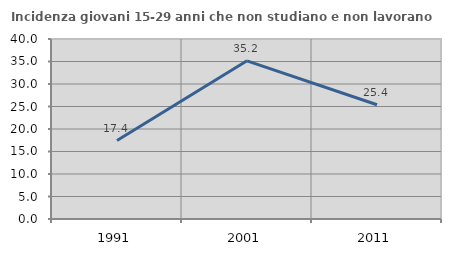
| Category | Incidenza giovani 15-29 anni che non studiano e non lavorano  |
|---|---|
| 1991.0 | 17.439 |
| 2001.0 | 35.154 |
| 2011.0 | 25.395 |